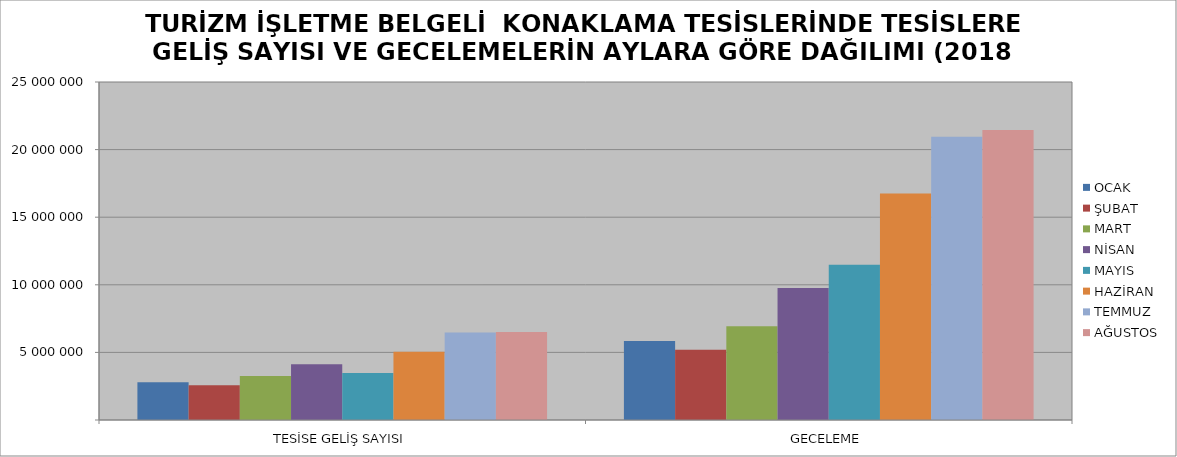
| Category | OCAK | ŞUBAT | MART | NİSAN | MAYIS | HAZİRAN | TEMMUZ | AĞUSTOS |
|---|---|---|---|---|---|---|---|---|
| TESİSE GELİŞ SAYISI | 2792196 | 2573999 | 3258929 | 4119434 | 3468117 | 5043280 | 6471045 | 6513976 |
| GECELEME | 5837753 | 5199578 | 6939659 | 9767435 | 11484758 | 16745602 | 20944829 | 21446796 |